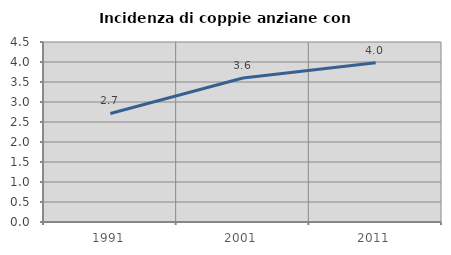
| Category | Incidenza di coppie anziane con figli |
|---|---|
| 1991.0 | 2.714 |
| 2001.0 | 3.599 |
| 2011.0 | 3.981 |